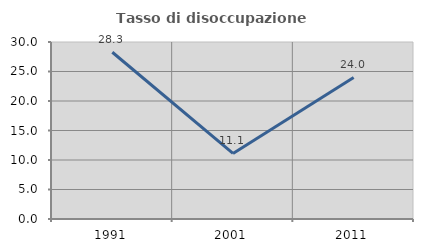
| Category | Tasso di disoccupazione giovanile  |
|---|---|
| 1991.0 | 28.261 |
| 2001.0 | 11.111 |
| 2011.0 | 24 |